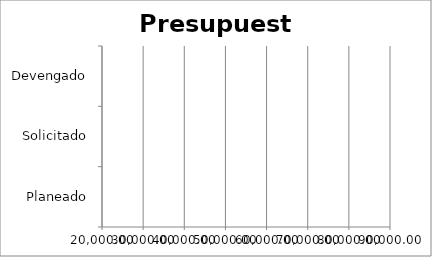
| Category | Series 0 |
|---|---|
| Planeado | 0 |
| Solicitado | 0 |
| Devengado | 0 |